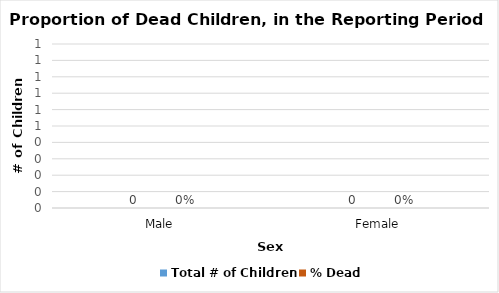
| Category | Total # of Children  | % Dead |
|---|---|---|
| Male | 0 | 0 |
| Female | 0 | 0 |